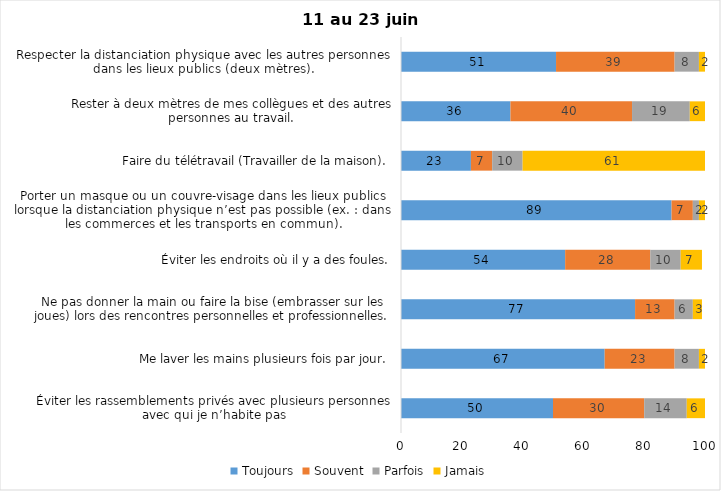
| Category | Toujours | Souvent | Parfois | Jamais |
|---|---|---|---|---|
| Éviter les rassemblements privés avec plusieurs personnes avec qui je n’habite pas | 50 | 30 | 14 | 6 |
| Me laver les mains plusieurs fois par jour. | 67 | 23 | 8 | 2 |
| Ne pas donner la main ou faire la bise (embrasser sur les joues) lors des rencontres personnelles et professionnelles. | 77 | 13 | 6 | 3 |
| Éviter les endroits où il y a des foules. | 54 | 28 | 10 | 7 |
| Porter un masque ou un couvre-visage dans les lieux publics lorsque la distanciation physique n’est pas possible (ex. : dans les commerces et les transports en commun). | 89 | 7 | 2 | 2 |
| Faire du télétravail (Travailler de la maison). | 23 | 7 | 10 | 61 |
| Rester à deux mètres de mes collègues et des autres personnes au travail. | 36 | 40 | 19 | 6 |
| Respecter la distanciation physique avec les autres personnes dans les lieux publics (deux mètres). | 51 | 39 | 8 | 2 |